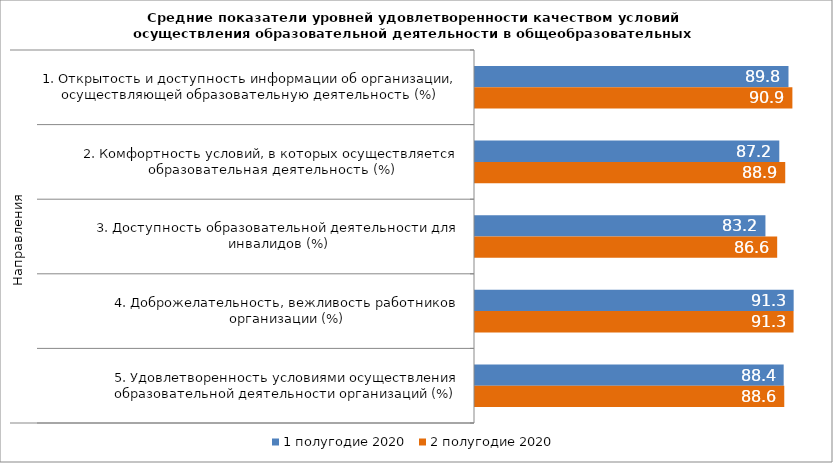
| Category | 1 полугодие 2020 | 2 полугодие 2020 |
|---|---|---|
| 0 | 89.826 | 90.942 |
| 1 | 87.191 | 88.893 |
| 2 | 83.22 | 86.586 |
| 3 | 91.307 | 91.278 |
| 4 | 88.446 | 88.616 |